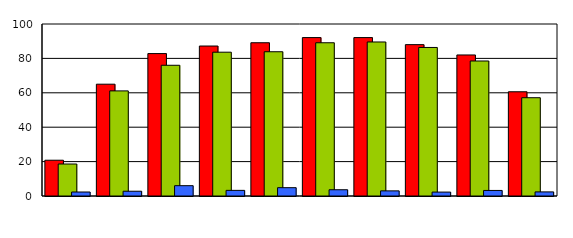
| Category | Series 0 | Series 1 | Series 2 |
|---|---|---|---|
| 0 | 20.8 | 18.605 | 2.326 |
| 1 | 65 | 61.111 | 2.778 |
| 2 | 82.8 | 76 | 6 |
| 3 | 87.2 | 83.607 | 3.279 |
| 4 | 89.1 | 83.871 | 4.839 |
| 5 | 92.1 | 89.091 | 3.636 |
| 6 | 92.1 | 89.552 | 2.985 |
| 7 | 88 | 86.364 | 2.273 |
| 8 | 82 | 78.495 | 3.226 |
| 9 | 60.6 | 57.143 | 2.381 |